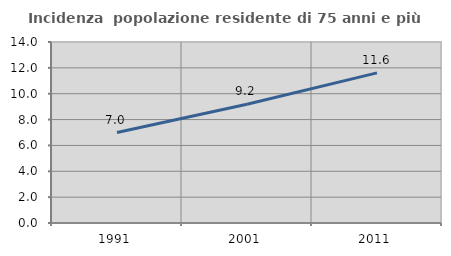
| Category | Incidenza  popolazione residente di 75 anni e più |
|---|---|
| 1991.0 | 6.998 |
| 2001.0 | 9.186 |
| 2011.0 | 11.611 |